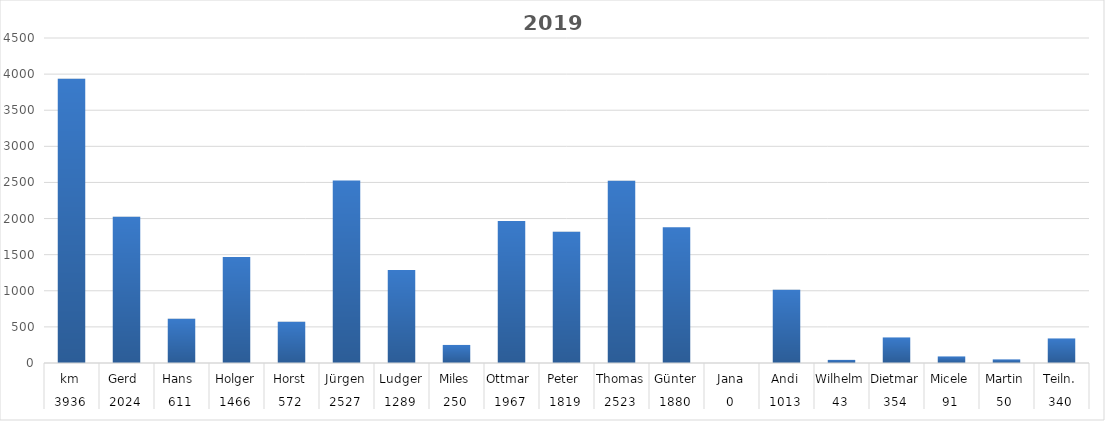
| Category | 2019 |
|---|---|
| 0 | 3936 |
| 1 | 2024 |
| 2 | 611 |
| 3 | 1466 |
| 4 | 572 |
| 5 | 2527 |
| 6 | 1289 |
| 7 | 250 |
| 8 | 1967 |
| 9 | 1819 |
| 10 | 2523 |
| 11 | 1880 |
| 12 | 0 |
| 13 | 1013 |
| 14 | 43 |
| 15 | 354 |
| 16 | 91 |
| 17 | 50 |
| 18 | 340 |